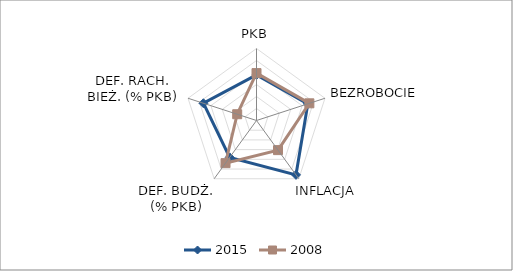
| Category | 2015 | 2008 |
|---|---|---|
| PKB | 7.6 | 7.9 |
| BEZROBOCIE | 8.996 | 9.264 |
| INFLACJA | 11.2 | 6.1 |
| DEF. BUDŻ. (% PKB) | 7.6 | 8.785 |
| DEF. RACH. BIEŻ. (% PKB) | 9.3 | 3.384 |